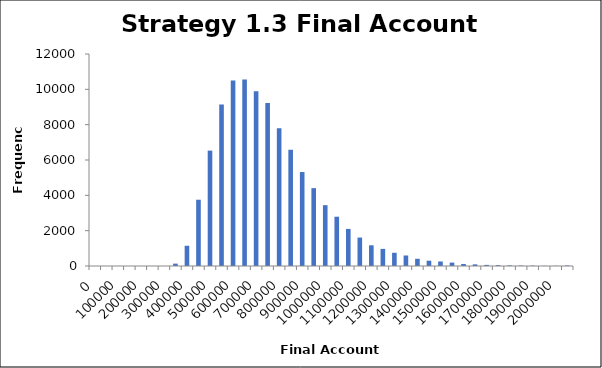
| Category | Frequency |
|---|---|
| 0 | 0 |
| 50000 | 0 |
| 100000 | 0 |
| 150000 | 0 |
| 200000 | 0 |
| 250000 | 1 |
| 300000 | 1 |
| 350000 | 134 |
| 400000 | 1146 |
| 450000 | 3752 |
| 500000 | 6531 |
| 550000 | 9140 |
| 600000 | 10506 |
| 650000 | 10550 |
| 700000 | 9890 |
| 750000 | 9230 |
| 800000 | 7794 |
| 850000 | 6579 |
| 900000 | 5319 |
| 950000 | 4407 |
| 1000000 | 3442 |
| 1050000 | 2789 |
| 1100000 | 2099 |
| 1150000 | 1610 |
| 1200000 | 1172 |
| 1250000 | 968 |
| 1300000 | 749 |
| 1350000 | 595 |
| 1400000 | 408 |
| 1450000 | 300 |
| 1500000 | 257 |
| 1550000 | 193 |
| 1600000 | 113 |
| 1650000 | 93 |
| 1700000 | 62 |
| 1750000 | 49 |
| 1800000 | 33 |
| 1850000 | 23 |
| 1900000 | 20 |
| 1950000 | 10 |
| 2000000 | 9 |
| More | 28 |